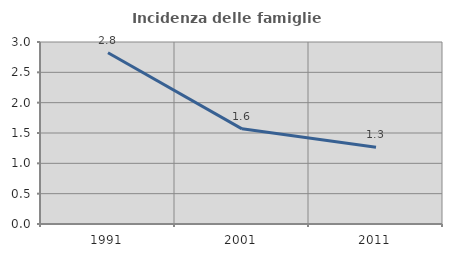
| Category | Incidenza delle famiglie numerose |
|---|---|
| 1991.0 | 2.823 |
| 2001.0 | 1.569 |
| 2011.0 | 1.266 |